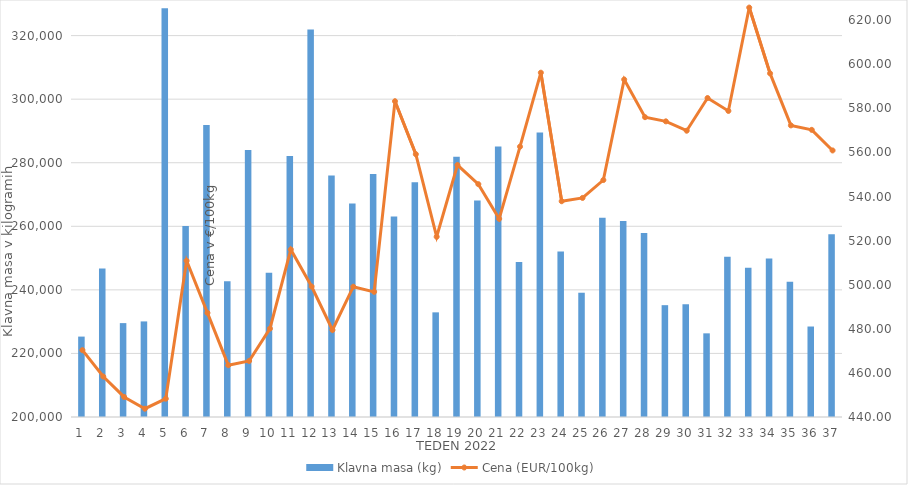
| Category | Klavna masa (kg) |
|---|---|
| 1.0 | 225300 |
| 2.0 | 246712 |
| 3.0 | 229541 |
| 4.0 | 230074 |
| 5.0 | 328640 |
| 6.0 | 260108 |
| 7.0 | 291887 |
| 8.0 | 242732 |
| 9.0 | 283987 |
| 10.0 | 245414 |
| 11.0 | 282092 |
| 12.0 | 321936 |
| 13.0 | 275950 |
| 14.0 | 267148 |
| 15.0 | 276417 |
| 16.0 | 263098 |
| 17.0 | 273824 |
| 18.0 | 232926 |
| 19.0 | 281859 |
| 20.0 | 268153 |
| 21.0 | 285073 |
| 22.0 | 248783 |
| 23.0 | 289478 |
| 24.0 | 252069 |
| 25.0 | 239099 |
| 26.0 | 262689 |
| 27.0 | 261656 |
| 28.0 | 257905 |
| 29.0 | 235185 |
| 30.0 | 235475 |
| 31.0 | 226322 |
| 32.0 | 250418 |
| 33.0 | 246996 |
| 34.0 | 249873 |
| 35.0 | 242516 |
| 36.0 | 228469 |
| 37.0 | 257511 |